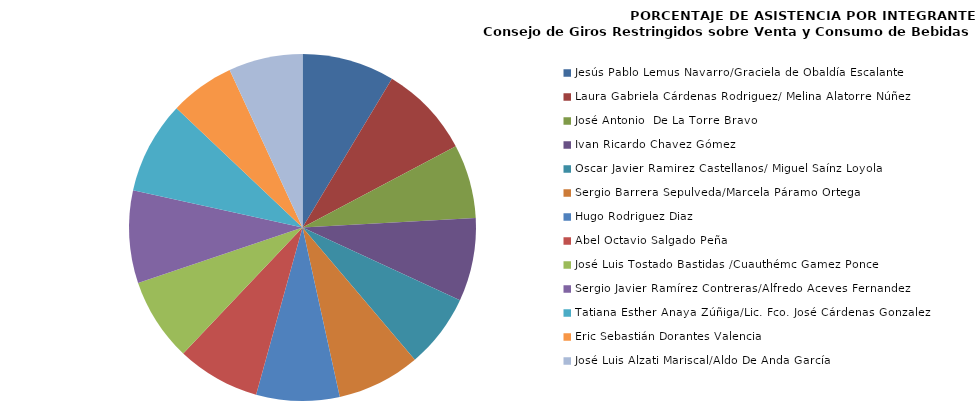
| Category | Series 0 |
|---|---|
| Jesús Pablo Lemus Navarro/Graciela de Obaldía Escalante | 100 |
| Laura Gabriela Cárdenas Rodriguez/ Melina Alatorre Núñez | 100 |
| José Antonio  De La Torre Bravo | 80 |
| Ivan Ricardo Chavez Gómez | 90 |
| Oscar Javier Ramirez Castellanos/ Miguel Saínz Loyola | 80 |
| Sergio Barrera Sepulveda/Marcela Páramo Ortega | 90 |
| Hugo Rodriguez Diaz | 90 |
| Abel Octavio Salgado Peña | 90 |
| José Luis Tostado Bastidas /Cuauthémc Gamez Ponce | 90 |
| Sergio Javier Ramírez Contreras/Alfredo Aceves Fernandez | 100 |
| Tatiana Esther Anaya Zúñiga/Lic. Fco. José Cárdenas Gonzalez | 100 |
| Eric Sebastián Dorantes Valencia | 70 |
| José Luis Alzati Mariscal/Aldo De Anda García | 80 |